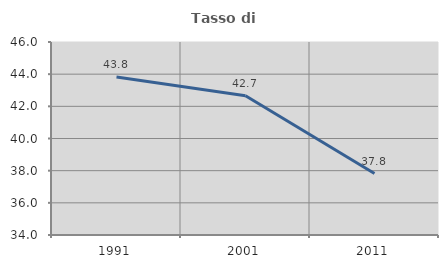
| Category | Tasso di occupazione   |
|---|---|
| 1991.0 | 43.825 |
| 2001.0 | 42.66 |
| 2011.0 | 37.822 |